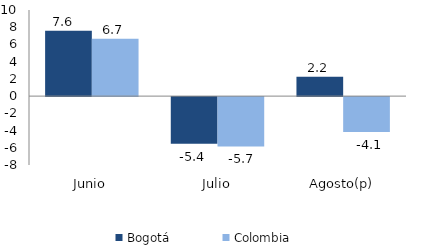
| Category | Bogotá | Colombia |
|---|---|---|
| Junio | 7.583 | 6.675 |
| Julio | -5.403 | -5.725 |
| Agosto(p) | 2.241 | -4.055 |